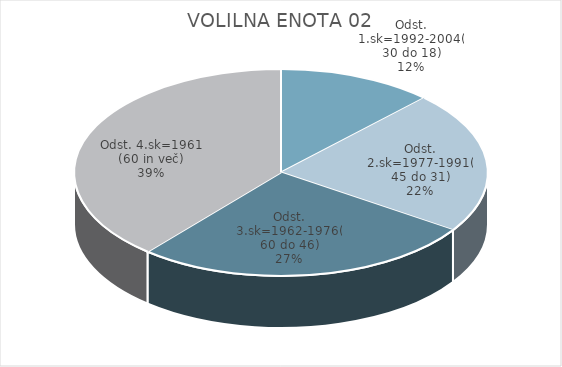
| Category | VOLILNA ENOTA 2 |
|---|---|
| Odst. 1.sk=1992-2004(30 do 18) | 8.27 |
| Odst. 2.sk=1977-1991(45 do 31) | 15.1 |
| Odst. 3.sk=1962-1976(60 do 46) | 18.16 |
| Odst. 4.sk=1961 (60 in več) | 26.41 |